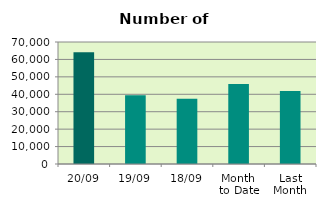
| Category | Series 0 |
|---|---|
| 20/09 | 64160 |
| 19/09 | 39390 |
| 18/09 | 37470 |
| Month 
to Date | 45862.4 |
| Last
Month | 41849.545 |